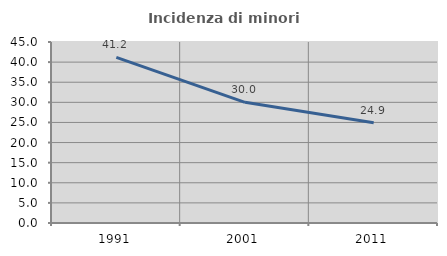
| Category | Incidenza di minori stranieri |
|---|---|
| 1991.0 | 41.176 |
| 2001.0 | 30 |
| 2011.0 | 24.921 |